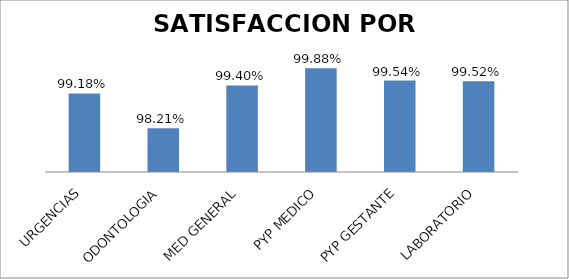
| Category | N° ENCUESTAS |
|---|---|
| URGENCIAS | 0.992 |
| ODONTOLOGIA | 0.982 |
| MED GENERAL | 0.994 |
| PYP MEDICO | 0.999 |
| PYP GESTANTE | 0.995 |
| LABORATORIO | 0.995 |